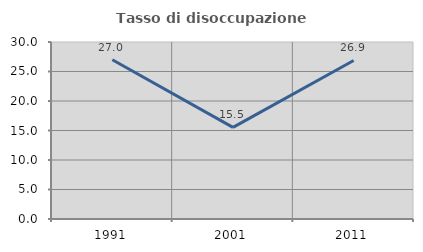
| Category | Tasso di disoccupazione giovanile  |
|---|---|
| 1991.0 | 26.984 |
| 2001.0 | 15.534 |
| 2011.0 | 26.866 |